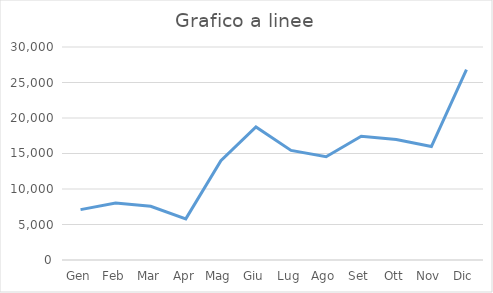
| Category | Scarpe |
|---|---|
| Gen | 7092 |
| Feb | 8020 |
| Mar | 7560 |
| Apr | 5796 |
| Mag | 13984 |
| Giu | 18743 |
| Lug | 15434 |
| Ago | 14545 |
| Set | 17434 |
| Ott | 16984 |
| Nov | 15983 |
| Dic | 26822 |